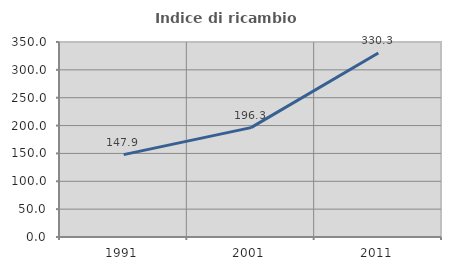
| Category | Indice di ricambio occupazionale  |
|---|---|
| 1991.0 | 147.895 |
| 2001.0 | 196.257 |
| 2011.0 | 330.319 |